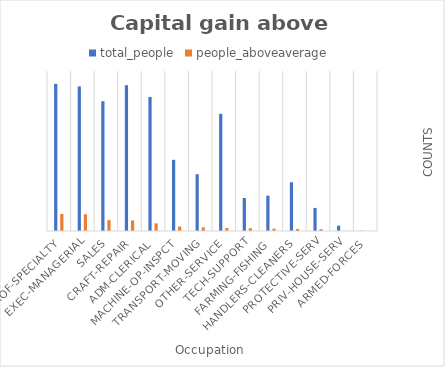
| Category | total_people | people_aboveaverage |
|---|---|---|
| Prof-specialty | 4140 | 478 |
| Exec-managerial | 4066 | 470 |
| Sales | 3650 | 306 |
| Craft-repair | 4099 | 296 |
| Adm-clerical | 3770 | 215 |
| Machine-op-inspct | 2002 | 125 |
| Transport-moving | 1597 | 104 |
| Other-service | 3295 | 84 |
| Tech-support | 928 | 78 |
| Farming-fishing | 994 | 66 |
| Handlers-cleaners | 1370 | 56 |
| Protective-serv | 649 | 50 |
| Priv-house-serv | 149 | 6 |
| Armed-Forces | 9 | 0 |